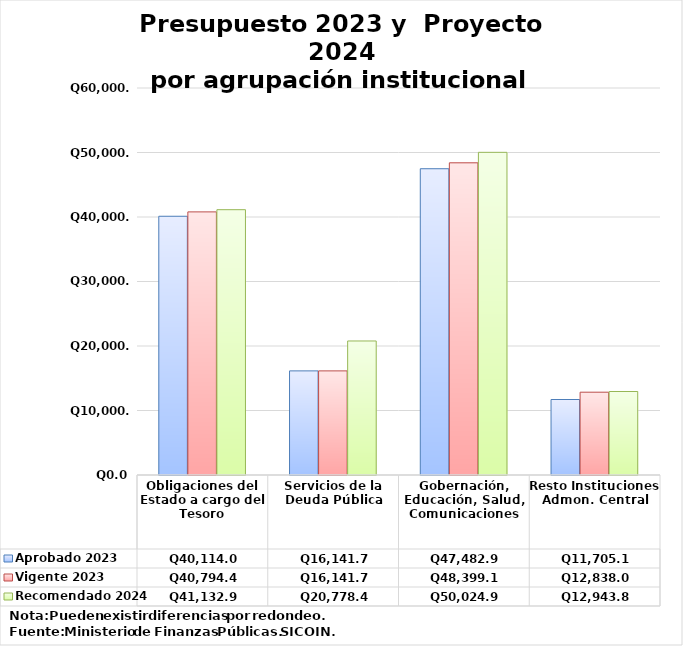
| Category | Aprobado 2023 | Vigente 2023 | Recomendado 2024 |
|---|---|---|---|
| Obligaciones del Estado a cargo del Tesoro | 40114 | 40794.4 | 41132.9 |
| Servicios de la Deuda Pública | 16141.7 | 16141.7 | 20778.4 |
| Gobernación, Educación, Salud, Comunicaciones | 47482.9 | 48399.1 | 50024.9 |
| Resto Instituciones Admon. Central | 11705.1 | 12838 | 12943.8 |